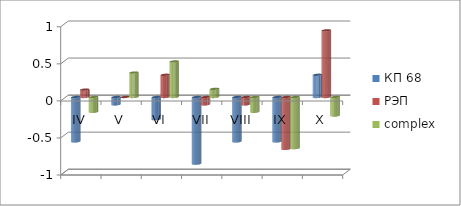
| Category | КП 68 | РЭП  | complex |
|---|---|---|---|
| IV | -0.6 | 0.1 | -0.2 |
| V | -0.1 | 0 | 0.33 |
| VI | -0.3 | 0.3 | 0.48 |
| VII | -0.9 | -0.1 | 0.11 |
| VIII | -0.6 | -0.1 | -0.2 |
| IX | -0.6 | -0.7 | -0.69 |
| X | 0.3 | 0.9 | -0.25 |